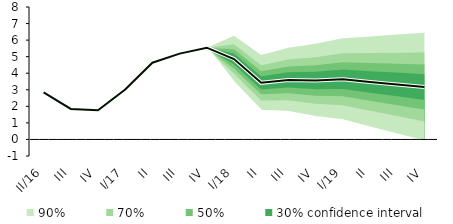
| Category | linka | Střed předpovědi |
|---|---|---|
| II/16 | 2.848 | 2.848 |
| III | 1.844 | 1.844 |
| IV | 1.766 | 1.766 |
| I/17 | 3.021 | 3.021 |
| II | 4.636 | 4.636 |
| III | 5.185 | 5.185 |
| IV | 5.543 | 5.543 |
| I/18 | 4.857 | 4.857 |
| II | 3.421 | 3.421 |
| III | 3.597 | 3.597 |
| IV | 3.562 | 3.562 |
| I/19 | 3.634 | 3.634 |
| II | 3.473 | 3.473 |
| III | 3.321 | 3.321 |
| IV | 3.165 | 3.165 |